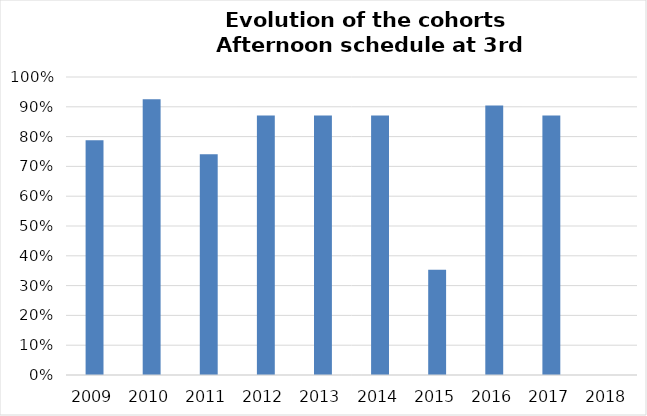
| Category | Series 0 |
|---|---|
| 2009.0 | 0.788 |
| 2010.0 | 0.925 |
| 2011.0 | 0.741 |
| 2012.0 | 0.871 |
| 2013.0 | 0.871 |
| 2014.0 | 0.871 |
| 2015.0 | 0.353 |
| 2016.0 | 0.904 |
| 2017.0 | 0.871 |
| 2018.0 | 0 |